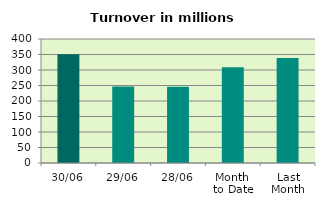
| Category | Series 0 |
|---|---|
| 30/06 | 351.101 |
| 29/06 | 246.441 |
| 28/06 | 246.225 |
| Month 
to Date | 308.534 |
| Last
Month | 338.969 |